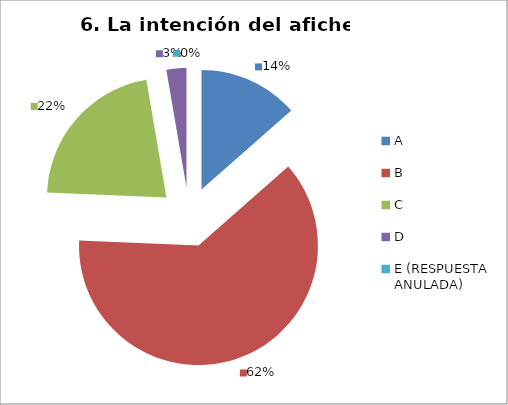
| Category | CANTIDAD DE RESPUESTAS PREGUNTA (6) | PORCENTAJE |
|---|---|---|
| A | 5 | 0.135 |
| B | 23 | 0.622 |
| C | 8 | 0.216 |
| D | 1 | 0.027 |
| E (RESPUESTA ANULADA) | 0 | 0 |